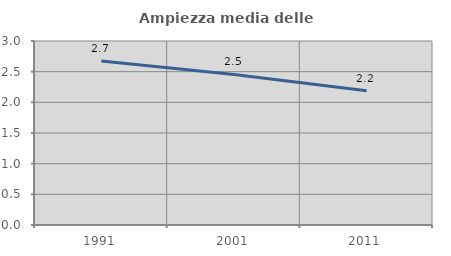
| Category | Ampiezza media delle famiglie |
|---|---|
| 1991.0 | 2.674 |
| 2001.0 | 2.455 |
| 2011.0 | 2.187 |